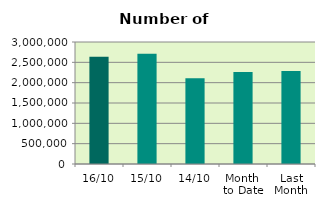
| Category | Series 0 |
|---|---|
| 16/10 | 2634606 |
| 15/10 | 2709806 |
| 14/10 | 2109438 |
| Month 
to Date | 2263966 |
| Last
Month | 2288803 |